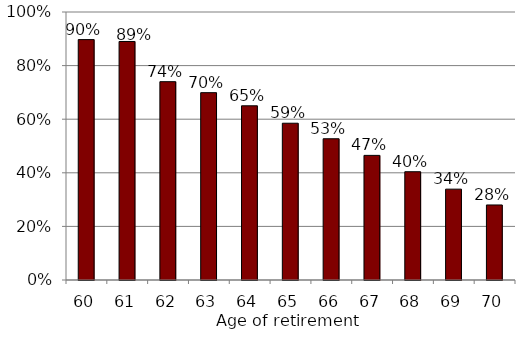
| Category | Series 0 |
|---|---|
| 60.0 | 0.897 |
| 61.0 | 0.89 |
| 62.0 | 0.74 |
| 63.0 | 0.699 |
| 64.0 | 0.65 |
| 65.0 | 0.585 |
| 66.0 | 0.527 |
| 67.0 | 0.465 |
| 68.0 | 0.404 |
| 69.0 | 0.339 |
| 70.0 | 0.28 |